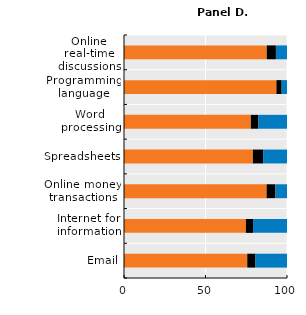
| Category | Never | Less than once a week | At least once a week |
|---|---|---|---|
| Email | 75.631 | 5.04 | 19.329 |
| Internet for information | 74.756 | 4.405 | 20.839 |
| Online money transactions | 87.491 | 5.417 | 7.091 |
| Spreadsheets | 79.069 | 6.272 | 14.66 |
| Word processing | 77.826 | 4.655 | 17.519 |
| Programming language | 93.495 | 3.233 | 3.272 |
| Online real-time discussions | 87.583 | 5.613 | 6.804 |